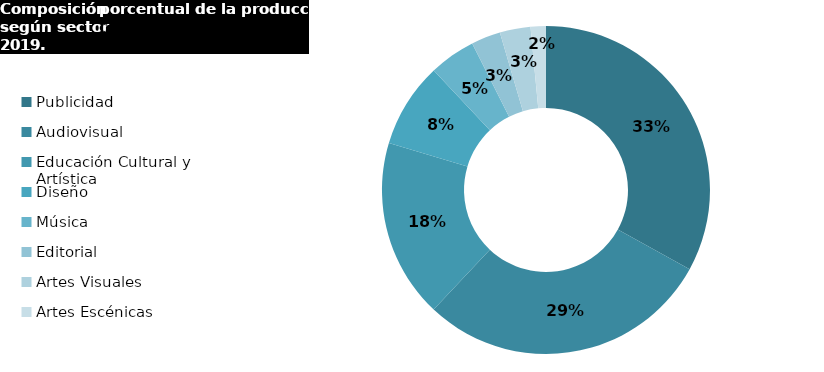
| Category | Series 0 |
|---|---|
| Publicidad | 439222.559 |
| Audiovisual | 385758.37 |
| Educación Cultural y Artística | 234484.969 |
| Diseño | 111324.015 |
| Música | 60800.408 |
| Editorial | 38495.787 |
| Artes Visuales | 40296.257 |
| Artes Escénicas | 20059.084 |